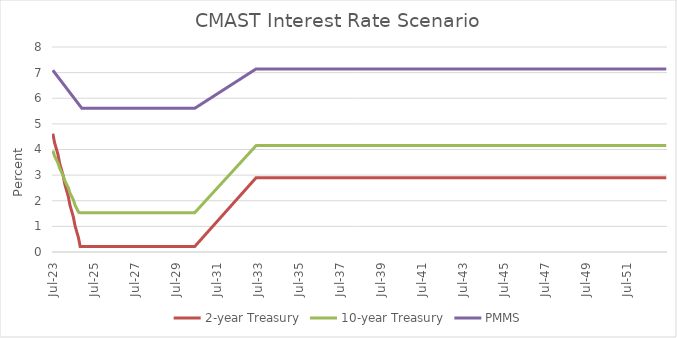
| Category | 2-year Treasury | 10-year Treasury | PMMS |
|---|---|---|---|
| 2023-07-30 | 4.618 | 3.953 | 7.092 |
| 2023-08-30 | 4.269 | 3.747 | 7.005 |
| 2023-09-30 | 4.037 | 3.61 | 6.917 |
| 2023-10-30 | 3.805 | 3.473 | 6.83 |
| 2023-11-30 | 3.456 | 3.267 | 6.742 |
| 2023-12-30 | 3.224 | 3.13 | 6.655 |
| 2024-01-30 | 2.992 | 2.993 | 6.567 |
| 2024-02-29 | 2.643 | 2.787 | 6.48 |
| 2024-03-29 | 2.411 | 2.65 | 6.392 |
| 2024-04-29 | 2.178 | 2.513 | 6.305 |
| 2024-05-29 | 1.83 | 2.307 | 6.217 |
| 2024-06-29 | 1.598 | 2.17 | 6.13 |
| 2024-07-29 | 1.365 | 2.033 | 6.042 |
| 2024-08-29 | 1.017 | 1.827 | 5.955 |
| 2024-09-29 | 0.785 | 1.69 | 5.867 |
| 2024-10-29 | 0.552 | 1.553 | 5.78 |
| 2024-11-29 | 0.21 | 1.53 | 5.692 |
| 2024-12-29 | 0.21 | 1.53 | 5.605 |
| 2025-01-29 | 0.21 | 1.53 | 5.605 |
| 2025-02-28 | 0.21 | 1.53 | 5.605 |
| 2025-03-28 | 0.21 | 1.53 | 5.605 |
| 2025-04-28 | 0.21 | 1.53 | 5.605 |
| 2025-05-28 | 0.21 | 1.53 | 5.605 |
| 2025-06-28 | 0.21 | 1.53 | 5.605 |
| 2025-07-28 | 0.21 | 1.53 | 5.605 |
| 2025-08-28 | 0.21 | 1.53 | 5.605 |
| 2025-09-28 | 0.21 | 1.53 | 5.605 |
| 2025-10-28 | 0.21 | 1.53 | 5.605 |
| 2025-11-28 | 0.21 | 1.53 | 5.605 |
| 2025-12-28 | 0.21 | 1.53 | 5.605 |
| 2026-01-28 | 0.21 | 1.53 | 5.605 |
| 2026-02-28 | 0.21 | 1.53 | 5.605 |
| 2026-03-28 | 0.21 | 1.53 | 5.605 |
| 2026-04-28 | 0.21 | 1.53 | 5.605 |
| 2026-05-28 | 0.21 | 1.53 | 5.605 |
| 2026-06-28 | 0.21 | 1.53 | 5.605 |
| 2026-07-28 | 0.21 | 1.53 | 5.605 |
| 2026-08-28 | 0.21 | 1.53 | 5.605 |
| 2026-09-28 | 0.21 | 1.53 | 5.605 |
| 2026-10-28 | 0.21 | 1.53 | 5.605 |
| 2026-11-28 | 0.21 | 1.53 | 5.605 |
| 2026-12-28 | 0.21 | 1.53 | 5.605 |
| 2027-01-28 | 0.21 | 1.53 | 5.605 |
| 2027-02-28 | 0.21 | 1.53 | 5.605 |
| 2027-03-28 | 0.21 | 1.53 | 5.605 |
| 2027-04-28 | 0.21 | 1.53 | 5.605 |
| 2027-05-28 | 0.21 | 1.53 | 5.605 |
| 2027-06-28 | 0.21 | 1.53 | 5.605 |
| 2027-07-28 | 0.21 | 1.53 | 5.605 |
| 2027-08-28 | 0.21 | 1.53 | 5.605 |
| 2027-09-28 | 0.21 | 1.53 | 5.605 |
| 2027-10-28 | 0.21 | 1.53 | 5.605 |
| 2027-11-28 | 0.21 | 1.53 | 5.605 |
| 2027-12-28 | 0.21 | 1.53 | 5.605 |
| 2028-01-28 | 0.21 | 1.53 | 5.605 |
| 2028-02-28 | 0.21 | 1.53 | 5.605 |
| 2028-03-28 | 0.21 | 1.53 | 5.605 |
| 2028-04-28 | 0.21 | 1.53 | 5.605 |
| 2028-05-28 | 0.21 | 1.53 | 5.605 |
| 2028-06-28 | 0.21 | 1.53 | 5.605 |
| 2028-07-28 | 0.21 | 1.53 | 5.605 |
| 2028-08-28 | 0.21 | 1.53 | 5.605 |
| 2028-09-28 | 0.21 | 1.53 | 5.605 |
| 2028-10-28 | 0.21 | 1.53 | 5.605 |
| 2028-11-28 | 0.21 | 1.53 | 5.605 |
| 2028-12-28 | 0.21 | 1.53 | 5.605 |
| 2029-01-28 | 0.21 | 1.53 | 5.605 |
| 2029-02-28 | 0.21 | 1.53 | 5.605 |
| 2029-03-28 | 0.21 | 1.53 | 5.605 |
| 2029-04-28 | 0.21 | 1.53 | 5.605 |
| 2029-05-28 | 0.21 | 1.53 | 5.605 |
| 2029-06-28 | 0.21 | 1.53 | 5.605 |
| 2029-07-28 | 0.21 | 1.53 | 5.605 |
| 2029-08-28 | 0.21 | 1.53 | 5.605 |
| 2029-09-28 | 0.21 | 1.53 | 5.605 |
| 2029-10-28 | 0.21 | 1.53 | 5.605 |
| 2029-11-28 | 0.21 | 1.53 | 5.605 |
| 2029-12-28 | 0.21 | 1.53 | 5.605 |
| 2030-01-28 | 0.21 | 1.53 | 5.605 |
| 2030-02-28 | 0.21 | 1.53 | 5.605 |
| 2030-03-28 | 0.21 | 1.53 | 5.605 |
| 2030-04-28 | 0.21 | 1.53 | 5.605 |
| 2030-05-28 | 0.21 | 1.53 | 5.605 |
| 2030-06-28 | 0.21 | 1.53 | 5.605 |
| 2030-07-28 | 0.285 | 1.603 | 5.648 |
| 2030-08-28 | 0.359 | 1.676 | 5.691 |
| 2030-09-28 | 0.434 | 1.749 | 5.733 |
| 2030-10-28 | 0.509 | 1.822 | 5.776 |
| 2030-11-28 | 0.584 | 1.895 | 5.819 |
| 2030-12-28 | 0.658 | 1.968 | 5.862 |
| 2031-01-28 | 0.733 | 2.04 | 5.905 |
| 2031-02-28 | 0.808 | 2.113 | 5.947 |
| 2031-03-28 | 0.883 | 2.186 | 5.99 |
| 2031-04-28 | 0.957 | 2.259 | 6.033 |
| 2031-05-28 | 1.032 | 2.332 | 6.076 |
| 2031-06-28 | 1.107 | 2.405 | 6.119 |
| 2031-07-28 | 1.181 | 2.478 | 6.161 |
| 2031-08-28 | 1.256 | 2.551 | 6.204 |
| 2031-09-28 | 1.331 | 2.624 | 6.247 |
| 2031-10-28 | 1.406 | 2.697 | 6.29 |
| 2031-11-28 | 1.48 | 2.77 | 6.333 |
| 2031-12-28 | 1.555 | 2.843 | 6.376 |
| 2032-01-28 | 1.63 | 2.915 | 6.418 |
| 2032-02-28 | 1.704 | 2.988 | 6.461 |
| 2032-03-28 | 1.779 | 3.061 | 6.504 |
| 2032-04-28 | 1.854 | 3.134 | 6.547 |
| 2032-05-28 | 1.929 | 3.207 | 6.59 |
| 2032-06-28 | 2.003 | 3.28 | 6.632 |
| 2032-07-28 | 2.078 | 3.353 | 6.675 |
| 2032-08-28 | 2.153 | 3.426 | 6.718 |
| 2032-09-28 | 2.228 | 3.499 | 6.761 |
| 2032-10-28 | 2.302 | 3.572 | 6.804 |
| 2032-11-28 | 2.377 | 3.645 | 6.846 |
| 2032-12-28 | 2.452 | 3.718 | 6.889 |
| 2033-01-28 | 2.526 | 3.79 | 6.932 |
| 2033-02-28 | 2.601 | 3.863 | 6.975 |
| 2033-03-28 | 2.676 | 3.936 | 7.018 |
| 2033-04-28 | 2.751 | 4.009 | 7.06 |
| 2033-05-28 | 2.825 | 4.082 | 7.103 |
| 2033-06-28 | 2.9 | 4.155 | 7.146 |
| 2033-07-28 | 2.9 | 4.155 | 7.146 |
| 2033-08-28 | 2.9 | 4.155 | 7.146 |
| 2033-09-28 | 2.9 | 4.155 | 7.146 |
| 2033-10-28 | 2.9 | 4.155 | 7.146 |
| 2033-11-28 | 2.9 | 4.155 | 7.146 |
| 2033-12-28 | 2.9 | 4.155 | 7.146 |
| 2034-01-28 | 2.9 | 4.155 | 7.146 |
| 2034-02-28 | 2.9 | 4.155 | 7.146 |
| 2034-03-28 | 2.9 | 4.155 | 7.146 |
| 2034-04-28 | 2.9 | 4.155 | 7.146 |
| 2034-05-28 | 2.9 | 4.155 | 7.146 |
| 2034-06-28 | 2.9 | 4.155 | 7.146 |
| 2034-07-28 | 2.9 | 4.155 | 7.146 |
| 2034-08-28 | 2.9 | 4.155 | 7.146 |
| 2034-09-28 | 2.9 | 4.155 | 7.146 |
| 2034-10-28 | 2.9 | 4.155 | 7.146 |
| 2034-11-28 | 2.9 | 4.155 | 7.146 |
| 2034-12-28 | 2.9 | 4.155 | 7.146 |
| 2035-01-28 | 2.9 | 4.155 | 7.146 |
| 2035-02-28 | 2.9 | 4.155 | 7.146 |
| 2035-03-28 | 2.9 | 4.155 | 7.146 |
| 2035-04-28 | 2.9 | 4.155 | 7.146 |
| 2035-05-28 | 2.9 | 4.155 | 7.146 |
| 2035-06-28 | 2.9 | 4.155 | 7.146 |
| 2035-07-28 | 2.9 | 4.155 | 7.146 |
| 2035-08-28 | 2.9 | 4.155 | 7.146 |
| 2035-09-28 | 2.9 | 4.155 | 7.146 |
| 2035-10-28 | 2.9 | 4.155 | 7.146 |
| 2035-11-28 | 2.9 | 4.155 | 7.146 |
| 2035-12-28 | 2.9 | 4.155 | 7.146 |
| 2036-01-28 | 2.9 | 4.155 | 7.146 |
| 2036-02-28 | 2.9 | 4.155 | 7.146 |
| 2036-03-28 | 2.9 | 4.155 | 7.146 |
| 2036-04-28 | 2.9 | 4.155 | 7.146 |
| 2036-05-28 | 2.9 | 4.155 | 7.146 |
| 2036-06-28 | 2.9 | 4.155 | 7.146 |
| 2036-07-28 | 2.9 | 4.155 | 7.146 |
| 2036-08-28 | 2.9 | 4.155 | 7.146 |
| 2036-09-28 | 2.9 | 4.155 | 7.146 |
| 2036-10-28 | 2.9 | 4.155 | 7.146 |
| 2036-11-28 | 2.9 | 4.155 | 7.146 |
| 2036-12-28 | 2.9 | 4.155 | 7.146 |
| 2037-01-28 | 2.9 | 4.155 | 7.146 |
| 2037-02-28 | 2.9 | 4.155 | 7.146 |
| 2037-03-28 | 2.9 | 4.155 | 7.146 |
| 2037-04-28 | 2.9 | 4.155 | 7.146 |
| 2037-05-28 | 2.9 | 4.155 | 7.146 |
| 2037-06-28 | 2.9 | 4.155 | 7.146 |
| 2037-07-28 | 2.9 | 4.155 | 7.146 |
| 2037-08-28 | 2.9 | 4.155 | 7.146 |
| 2037-09-28 | 2.9 | 4.155 | 7.146 |
| 2037-10-28 | 2.9 | 4.155 | 7.146 |
| 2037-11-28 | 2.9 | 4.155 | 7.146 |
| 2037-12-28 | 2.9 | 4.155 | 7.146 |
| 2038-01-28 | 2.9 | 4.155 | 7.146 |
| 2038-02-28 | 2.9 | 4.155 | 7.146 |
| 2038-03-28 | 2.9 | 4.155 | 7.146 |
| 2038-04-28 | 2.9 | 4.155 | 7.146 |
| 2038-05-28 | 2.9 | 4.155 | 7.146 |
| 2038-06-28 | 2.9 | 4.155 | 7.146 |
| 2038-07-28 | 2.9 | 4.155 | 7.146 |
| 2038-08-28 | 2.9 | 4.155 | 7.146 |
| 2038-09-28 | 2.9 | 4.155 | 7.146 |
| 2038-10-28 | 2.9 | 4.155 | 7.146 |
| 2038-11-28 | 2.9 | 4.155 | 7.146 |
| 2038-12-28 | 2.9 | 4.155 | 7.146 |
| 2039-01-28 | 2.9 | 4.155 | 7.146 |
| 2039-02-28 | 2.9 | 4.155 | 7.146 |
| 2039-03-28 | 2.9 | 4.155 | 7.146 |
| 2039-04-28 | 2.9 | 4.155 | 7.146 |
| 2039-05-28 | 2.9 | 4.155 | 7.146 |
| 2039-06-28 | 2.9 | 4.155 | 7.146 |
| 2039-07-28 | 2.9 | 4.155 | 7.146 |
| 2039-08-28 | 2.9 | 4.155 | 7.146 |
| 2039-09-28 | 2.9 | 4.155 | 7.146 |
| 2039-10-28 | 2.9 | 4.155 | 7.146 |
| 2039-11-28 | 2.9 | 4.155 | 7.146 |
| 2039-12-28 | 2.9 | 4.155 | 7.146 |
| 2040-01-28 | 2.9 | 4.155 | 7.146 |
| 2040-02-28 | 2.9 | 4.155 | 7.146 |
| 2040-03-28 | 2.9 | 4.155 | 7.146 |
| 2040-04-28 | 2.9 | 4.155 | 7.146 |
| 2040-05-28 | 2.9 | 4.155 | 7.146 |
| 2040-06-28 | 2.9 | 4.155 | 7.146 |
| 2040-07-28 | 2.9 | 4.155 | 7.146 |
| 2040-08-28 | 2.9 | 4.155 | 7.146 |
| 2040-09-28 | 2.9 | 4.155 | 7.146 |
| 2040-10-28 | 2.9 | 4.155 | 7.146 |
| 2040-11-28 | 2.9 | 4.155 | 7.146 |
| 2040-12-28 | 2.9 | 4.155 | 7.146 |
| 2041-01-28 | 2.9 | 4.155 | 7.146 |
| 2041-02-28 | 2.9 | 4.155 | 7.146 |
| 2041-03-28 | 2.9 | 4.155 | 7.146 |
| 2041-04-28 | 2.9 | 4.155 | 7.146 |
| 2041-05-28 | 2.9 | 4.155 | 7.146 |
| 2041-06-28 | 2.9 | 4.155 | 7.146 |
| 2041-07-28 | 2.9 | 4.155 | 7.146 |
| 2041-08-28 | 2.9 | 4.155 | 7.146 |
| 2041-09-28 | 2.9 | 4.155 | 7.146 |
| 2041-10-28 | 2.9 | 4.155 | 7.146 |
| 2041-11-28 | 2.9 | 4.155 | 7.146 |
| 2041-12-28 | 2.9 | 4.155 | 7.146 |
| 2042-01-28 | 2.9 | 4.155 | 7.146 |
| 2042-02-28 | 2.9 | 4.155 | 7.146 |
| 2042-03-28 | 2.9 | 4.155 | 7.146 |
| 2042-04-28 | 2.9 | 4.155 | 7.146 |
| 2042-05-28 | 2.9 | 4.155 | 7.146 |
| 2042-06-28 | 2.9 | 4.155 | 7.146 |
| 2042-07-28 | 2.9 | 4.155 | 7.146 |
| 2042-08-28 | 2.9 | 4.155 | 7.146 |
| 2042-09-28 | 2.9 | 4.155 | 7.146 |
| 2042-10-28 | 2.9 | 4.155 | 7.146 |
| 2042-11-28 | 2.9 | 4.155 | 7.146 |
| 2042-12-28 | 2.9 | 4.155 | 7.146 |
| 2043-01-28 | 2.9 | 4.155 | 7.146 |
| 2043-02-28 | 2.9 | 4.155 | 7.146 |
| 2043-03-28 | 2.9 | 4.155 | 7.146 |
| 2043-04-28 | 2.9 | 4.155 | 7.146 |
| 2043-05-28 | 2.9 | 4.155 | 7.146 |
| 2043-06-28 | 2.9 | 4.155 | 7.146 |
| 2043-07-28 | 2.9 | 4.155 | 7.146 |
| 2043-08-28 | 2.9 | 4.155 | 7.146 |
| 2043-09-28 | 2.9 | 4.155 | 7.146 |
| 2043-10-28 | 2.9 | 4.155 | 7.146 |
| 2043-11-28 | 2.9 | 4.155 | 7.146 |
| 2043-12-28 | 2.9 | 4.155 | 7.146 |
| 2044-01-28 | 2.9 | 4.155 | 7.146 |
| 2044-02-28 | 2.9 | 4.155 | 7.146 |
| 2044-03-28 | 2.9 | 4.155 | 7.146 |
| 2044-04-28 | 2.9 | 4.155 | 7.146 |
| 2044-05-28 | 2.9 | 4.155 | 7.146 |
| 2044-06-28 | 2.9 | 4.155 | 7.146 |
| 2044-07-28 | 2.9 | 4.155 | 7.146 |
| 2044-08-28 | 2.9 | 4.155 | 7.146 |
| 2044-09-28 | 2.9 | 4.155 | 7.146 |
| 2044-10-28 | 2.9 | 4.155 | 7.146 |
| 2044-11-28 | 2.9 | 4.155 | 7.146 |
| 2044-12-28 | 2.9 | 4.155 | 7.146 |
| 2045-01-28 | 2.9 | 4.155 | 7.146 |
| 2045-02-28 | 2.9 | 4.155 | 7.146 |
| 2045-03-28 | 2.9 | 4.155 | 7.146 |
| 2045-04-28 | 2.9 | 4.155 | 7.146 |
| 2045-05-28 | 2.9 | 4.155 | 7.146 |
| 2045-06-28 | 2.9 | 4.155 | 7.146 |
| 2045-07-28 | 2.9 | 4.155 | 7.146 |
| 2045-08-28 | 2.9 | 4.155 | 7.146 |
| 2045-09-28 | 2.9 | 4.155 | 7.146 |
| 2045-10-28 | 2.9 | 4.155 | 7.146 |
| 2045-11-28 | 2.9 | 4.155 | 7.146 |
| 2045-12-28 | 2.9 | 4.155 | 7.146 |
| 2046-01-28 | 2.9 | 4.155 | 7.146 |
| 2046-02-28 | 2.9 | 4.155 | 7.146 |
| 2046-03-28 | 2.9 | 4.155 | 7.146 |
| 2046-04-28 | 2.9 | 4.155 | 7.146 |
| 2046-05-28 | 2.9 | 4.155 | 7.146 |
| 2046-06-28 | 2.9 | 4.155 | 7.146 |
| 2046-07-28 | 2.9 | 4.155 | 7.146 |
| 2046-08-28 | 2.9 | 4.155 | 7.146 |
| 2046-09-28 | 2.9 | 4.155 | 7.146 |
| 2046-10-28 | 2.9 | 4.155 | 7.146 |
| 2046-11-28 | 2.9 | 4.155 | 7.146 |
| 2046-12-28 | 2.9 | 4.155 | 7.146 |
| 2047-01-28 | 2.9 | 4.155 | 7.146 |
| 2047-02-28 | 2.9 | 4.155 | 7.146 |
| 2047-03-28 | 2.9 | 4.155 | 7.146 |
| 2047-04-28 | 2.9 | 4.155 | 7.146 |
| 2047-05-28 | 2.9 | 4.155 | 7.146 |
| 2047-06-28 | 2.9 | 4.155 | 7.146 |
| 2047-07-28 | 2.9 | 4.155 | 7.146 |
| 2047-08-28 | 2.9 | 4.155 | 7.146 |
| 2047-09-28 | 2.9 | 4.155 | 7.146 |
| 2047-10-28 | 2.9 | 4.155 | 7.146 |
| 2047-11-28 | 2.9 | 4.155 | 7.146 |
| 2047-12-28 | 2.9 | 4.155 | 7.146 |
| 2048-01-28 | 2.9 | 4.155 | 7.146 |
| 2048-02-28 | 2.9 | 4.155 | 7.146 |
| 2048-03-28 | 2.9 | 4.155 | 7.146 |
| 2048-04-28 | 2.9 | 4.155 | 7.146 |
| 2048-05-28 | 2.9 | 4.155 | 7.146 |
| 2048-06-28 | 2.9 | 4.155 | 7.146 |
| 2048-07-28 | 2.9 | 4.155 | 7.146 |
| 2048-08-28 | 2.9 | 4.155 | 7.146 |
| 2048-09-28 | 2.9 | 4.155 | 7.146 |
| 2048-10-28 | 2.9 | 4.155 | 7.146 |
| 2048-11-28 | 2.9 | 4.155 | 7.146 |
| 2048-12-28 | 2.9 | 4.155 | 7.146 |
| 2049-01-28 | 2.9 | 4.155 | 7.146 |
| 2049-02-28 | 2.9 | 4.155 | 7.146 |
| 2049-03-28 | 2.9 | 4.155 | 7.146 |
| 2049-04-28 | 2.9 | 4.155 | 7.146 |
| 2049-05-28 | 2.9 | 4.155 | 7.146 |
| 2049-06-28 | 2.9 | 4.155 | 7.146 |
| 2049-07-28 | 2.9 | 4.155 | 7.146 |
| 2049-08-28 | 2.9 | 4.155 | 7.146 |
| 2049-09-28 | 2.9 | 4.155 | 7.146 |
| 2049-10-28 | 2.9 | 4.155 | 7.146 |
| 2049-11-28 | 2.9 | 4.155 | 7.146 |
| 2049-12-28 | 2.9 | 4.155 | 7.146 |
| 2050-01-28 | 2.9 | 4.155 | 7.146 |
| 2050-02-28 | 2.9 | 4.155 | 7.146 |
| 2050-03-28 | 2.9 | 4.155 | 7.146 |
| 2050-04-28 | 2.9 | 4.155 | 7.146 |
| 2050-05-28 | 2.9 | 4.155 | 7.146 |
| 2050-06-28 | 2.9 | 4.155 | 7.146 |
| 2050-07-28 | 2.9 | 4.155 | 7.146 |
| 2050-08-28 | 2.9 | 4.155 | 7.146 |
| 2050-09-28 | 2.9 | 4.155 | 7.146 |
| 2050-10-28 | 2.9 | 4.155 | 7.146 |
| 2050-11-28 | 2.9 | 4.155 | 7.146 |
| 2050-12-28 | 2.9 | 4.155 | 7.146 |
| 2051-01-28 | 2.9 | 4.155 | 7.146 |
| 2051-02-28 | 2.9 | 4.155 | 7.146 |
| 2051-03-28 | 2.9 | 4.155 | 7.146 |
| 2051-04-28 | 2.9 | 4.155 | 7.146 |
| 2051-05-28 | 2.9 | 4.155 | 7.146 |
| 2051-06-28 | 2.9 | 4.155 | 7.146 |
| 2051-07-28 | 2.9 | 4.155 | 7.146 |
| 2051-08-28 | 2.9 | 4.155 | 7.146 |
| 2051-09-28 | 2.9 | 4.155 | 7.146 |
| 2051-10-28 | 2.9 | 4.155 | 7.146 |
| 2051-11-28 | 2.9 | 4.155 | 7.146 |
| 2051-12-28 | 2.9 | 4.155 | 7.146 |
| 2052-01-28 | 2.9 | 4.155 | 7.146 |
| 2052-02-28 | 2.9 | 4.155 | 7.146 |
| 2052-03-28 | 2.9 | 4.155 | 7.146 |
| 2052-04-28 | 2.9 | 4.155 | 7.146 |
| 2052-05-28 | 2.9 | 4.155 | 7.146 |
| 2052-06-28 | 2.9 | 4.155 | 7.146 |
| 2052-07-28 | 2.9 | 4.155 | 7.146 |
| 2052-08-28 | 2.9 | 4.155 | 7.146 |
| 2052-09-28 | 2.9 | 4.155 | 7.146 |
| 2052-10-28 | 2.9 | 4.155 | 7.146 |
| 2052-11-28 | 2.9 | 4.155 | 7.146 |
| 2052-12-28 | 2.9 | 4.155 | 7.146 |
| 2053-01-28 | 2.9 | 4.155 | 7.146 |
| 2053-02-28 | 2.9 | 4.155 | 7.146 |
| 2053-03-28 | 2.9 | 4.155 | 7.146 |
| 2053-04-28 | 2.9 | 4.155 | 7.146 |
| 2053-05-28 | 2.9 | 4.155 | 7.146 |
| 2053-06-28 | 2.9 | 4.155 | 7.146 |